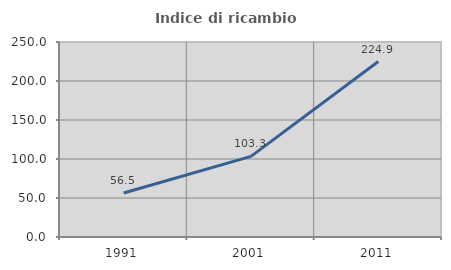
| Category | Indice di ricambio occupazionale  |
|---|---|
| 1991.0 | 56.487 |
| 2001.0 | 103.321 |
| 2011.0 | 224.929 |